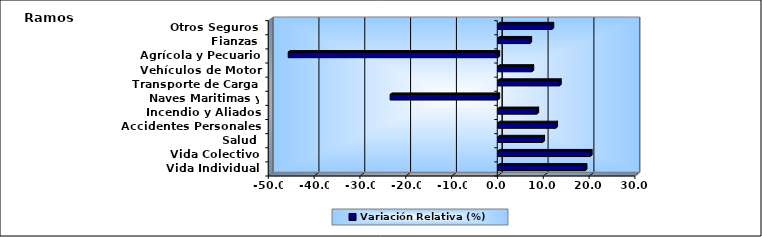
| Category | Variación Relativa (%) |
|---|---|
| Vida Individual | 19.037 |
| Vida Colectivo | 20.165 |
| Salud | 9.781 |
| Accidentes Personales | 12.625 |
| Incendio y Aliados | 8.501 |
| Naves Maritimas y Aéreas | -23.498 |
| Transporte de Carga | 13.431 |
| Vehículos de Motor | 7.429 |
| Agrícola y Pecuario | -45.736 |
| Fianzas | 6.969 |
| Otros Seguros | 11.792 |